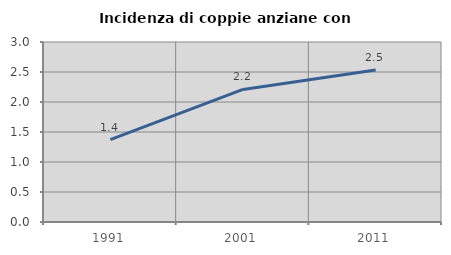
| Category | Incidenza di coppie anziane con figli |
|---|---|
| 1991.0 | 1.372 |
| 2001.0 | 2.209 |
| 2011.0 | 2.532 |